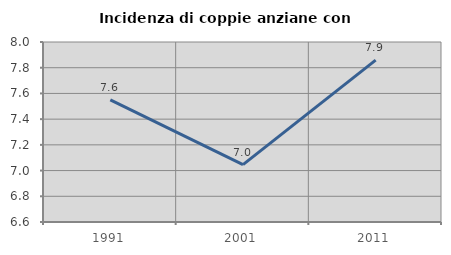
| Category | Incidenza di coppie anziane con figli |
|---|---|
| 1991.0 | 7.55 |
| 2001.0 | 7.046 |
| 2011.0 | 7.859 |